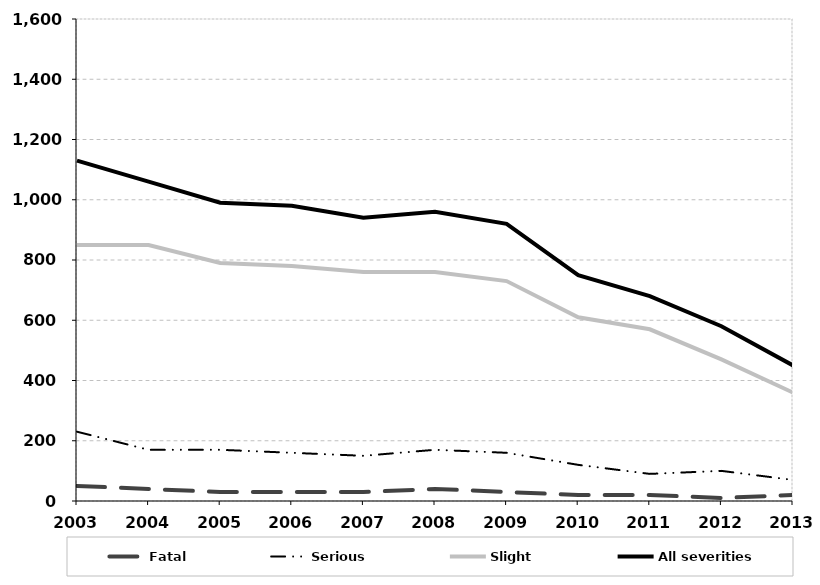
| Category | Fatal | Serious | Slight | All severities |
|---|---|---|---|---|
| 2003.0 | 50 | 230 | 850 | 1130 |
| 2004.0 | 40 | 170 | 850 | 1060 |
| 2005.0 | 30 | 170 | 790 | 990 |
| 2006.0 | 30 | 160 | 780 | 980 |
| 2007.0 | 30 | 150 | 760 | 940 |
| 2008.0 | 40 | 170 | 760 | 960 |
| 2009.0 | 30 | 160 | 730 | 920 |
| 2010.0 | 20 | 120 | 610 | 750 |
| 2011.0 | 20 | 90 | 570 | 680 |
| 2012.0 | 10 | 100 | 470 | 580 |
| 2013.0 | 20 | 70 | 360 | 450 |